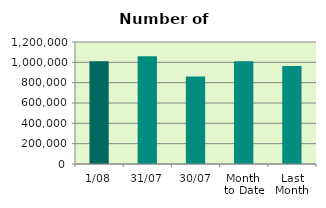
| Category | Series 0 |
|---|---|
| 1/08 | 1009854 |
| 31/07 | 1060870 |
| 30/07 | 861580 |
| Month 
to Date | 1009854 |
| Last
Month | 964212.818 |